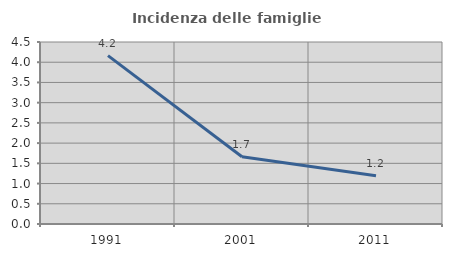
| Category | Incidenza delle famiglie numerose |
|---|---|
| 1991.0 | 4.163 |
| 2001.0 | 1.663 |
| 2011.0 | 1.19 |